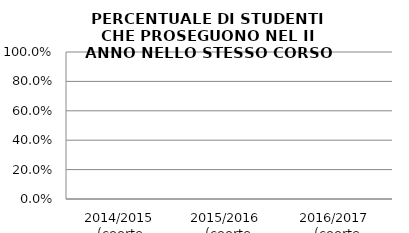
| Category | 2014/2015 (coorte 2013/14) 2015/2016  (coorte 2014/15) 2016/2017  (coorte 2015/16) |
|---|---|
| 2014/2015 (coorte 2013/14) | 0 |
| 2015/2016  (coorte 2014/15) | 0 |
| 2016/2017  (coorte 2015/16) | 0 |